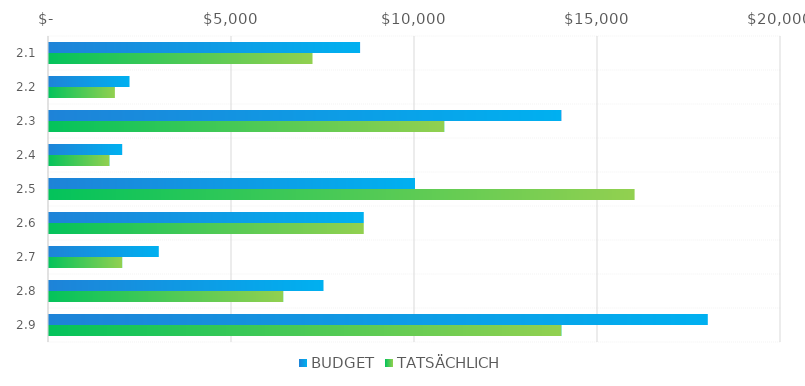
| Category | BUDGET | TATSÄCHLICH |
|---|---|---|
| 2.1 | 8500 | 7200 |
| 2.2 | 2200 | 1800 |
| 2.3 | 14000 | 10800 |
| 2.4 | 2000 | 1650 |
| 2.5 | 10000 | 16000 |
| 2.6 | 8600 | 8600 |
| 2.7 | 3000 | 2000 |
| 2.8 | 7500 | 6400 |
| 2.9 | 18000 | 14000 |